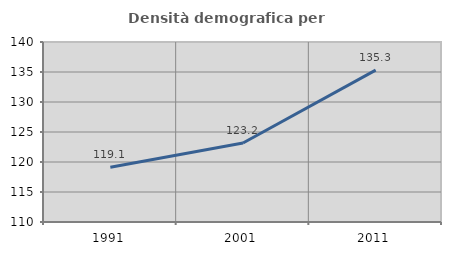
| Category | Densità demografica |
|---|---|
| 1991.0 | 119.129 |
| 2001.0 | 123.174 |
| 2011.0 | 135.311 |